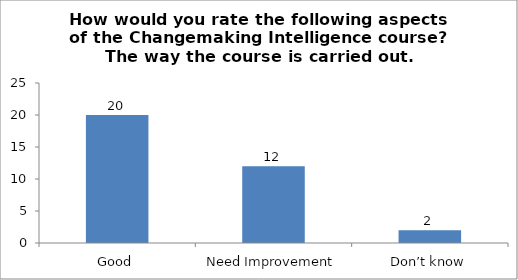
| Category | How would you rate the following aspects of the Changemaking Intelligence course?
The way the course is carried out. |
|---|---|
| Good | 20 |
| Need Improvement | 12 |
| Don’t know | 2 |